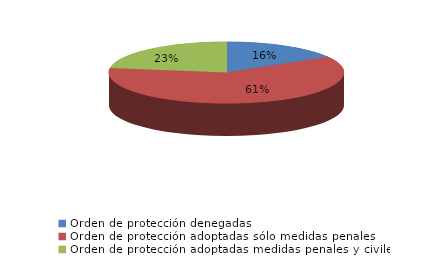
| Category | Series 0 |
|---|---|
| Orden de protección denegadas | 63 |
| Orden de protección adoptadas sólo medidas penales | 234 |
| Orden de protección adoptadas medidas penales y civiles | 87 |